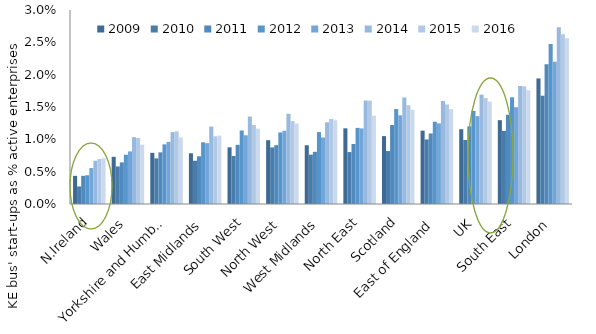
| Category | 2009 | 2010 | 2011 | 2012 | 2013 | 2014 | 2015 | 2016 |
|---|---|---|---|---|---|---|---|---|
| N.Ireland | 0.004 | 0.003 | 0.004 | 0.004 | 0.006 | 0.007 | 0.007 | 0.007 |
| Wales | 0.007 | 0.006 | 0.006 | 0.008 | 0.008 | 0.01 | 0.01 | 0.009 |
| Yorkshire and Humber | 0.008 | 0.007 | 0.008 | 0.009 | 0.01 | 0.011 | 0.011 | 0.01 |
| East Midlands | 0.008 | 0.007 | 0.007 | 0.01 | 0.009 | 0.012 | 0.01 | 0.011 |
| South West | 0.009 | 0.007 | 0.009 | 0.011 | 0.011 | 0.014 | 0.012 | 0.012 |
| North West | 0.01 | 0.009 | 0.009 | 0.011 | 0.011 | 0.014 | 0.013 | 0.012 |
| West Midlands | 0.009 | 0.008 | 0.008 | 0.011 | 0.01 | 0.013 | 0.013 | 0.013 |
| North East | 0.012 | 0.008 | 0.009 | 0.012 | 0.012 | 0.016 | 0.016 | 0.014 |
| Scotland | 0.011 | 0.008 | 0.012 | 0.015 | 0.014 | 0.016 | 0.015 | 0.015 |
| East of England | 0.011 | 0.01 | 0.011 | 0.013 | 0.012 | 0.016 | 0.015 | 0.015 |
| UK | 0.012 | 0.01 | 0.012 | 0.014 | 0.014 | 0.017 | 0.016 | 0.016 |
| South East | 0.013 | 0.011 | 0.014 | 0.016 | 0.015 | 0.018 | 0.018 | 0.018 |
| London | 0.019 | 0.017 | 0.022 | 0.025 | 0.022 | 0.027 | 0.026 | 0.026 |